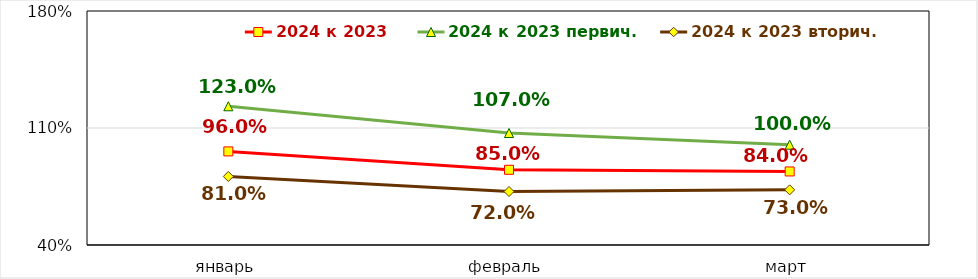
| Category | 2024 к 2023 | 2024 к 2023 первич. | 2024 к 2023 вторич. |
|---|---|---|---|
| январь | 0.96 | 1.23 | 0.81 |
| февраль | 0.85 | 1.07 | 0.72 |
| март | 0.84 | 1 | 0.73 |